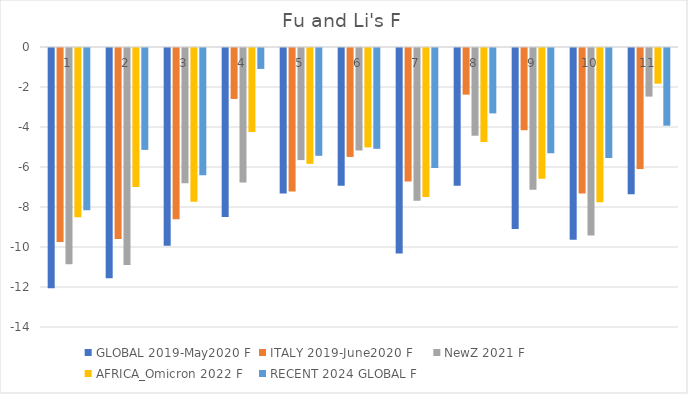
| Category | GLOBAL 2019-May2020 | ITALY 2019-June2020 | NewZ 2021 | AFRICA_Omicron 2022 | RECENT 2024 GLOBAL |
|---|---|---|---|---|---|
| 0 | -12.01 | -9.695 | -10.808 | -8.462 | -8.108 |
| 1 | -11.512 | -9.553 | -10.85 | -6.945 | -5.094 |
| 2 | -9.892 | -8.559 | -6.765 | -7.688 | -6.368 |
| 3 | -8.452 | -2.547 | -6.72 | -4.202 | -1.048 |
| 4 | -7.275 | -7.171 | -5.605 | -5.792 | -5.39 |
| 5 | -6.889 | -5.446 | -5.125 | -4.97 | -5.042 |
| 6 | -10.27 | -6.673 | -7.634 | -7.451 | -6 |
| 7 | -6.889 | -2.332 | -4.386 | -4.7 | -3.27 |
| 8 | -9.055 | -4.112 | -7.089 | -6.542 | -5.262 |
| 9 | -9.581 | -7.279 | -9.373 | -7.711 | -5.499 |
| 10 | -7.315 | -6.053 | -2.431 | -1.784 | -3.885 |